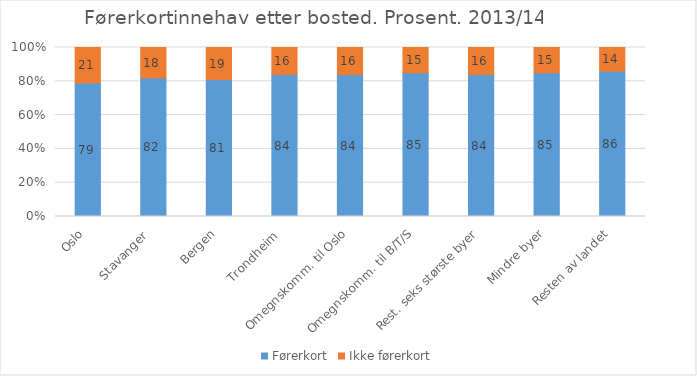
| Category | Førerkort | Ikke førerkort |
|---|---|---|
| Oslo | 79 | 21 |
| Stavanger  | 82 | 18 |
| Bergen | 81 | 19 |
| Trondheim  | 84 | 16 |
| Omegnskomm. til Oslo | 84 | 16 |
| Omegnskomm. til B/T/S | 85 | 15 |
| Rest. seks største byer | 84 | 16 |
| Mindre byer | 85 | 15 |
| Resten av landet | 86 | 14 |